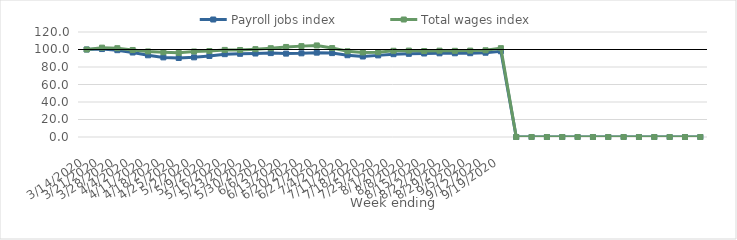
| Category | Payroll jobs index | Total wages index |
|---|---|---|
| 14/03/2020 | 100 | 100 |
| 21/03/2020 | 100.506 | 102.114 |
| 28/03/2020 | 99.227 | 101.498 |
| 04/04/2020 | 96.543 | 99.453 |
| 11/04/2020 | 93.391 | 97.778 |
| 18/04/2020 | 90.995 | 96.86 |
| 25/04/2020 | 90.273 | 96.172 |
| 02/05/2020 | 91.049 | 97.727 |
| 09/05/2020 | 92.612 | 98.286 |
| 16/05/2020 | 94.663 | 99.52 |
| 23/05/2020 | 95.086 | 99.444 |
| 30/05/2020 | 95.404 | 100.386 |
| 06/06/2020 | 95.877 | 101.47 |
| 13/06/2020 | 95.29 | 102.898 |
| 20/06/2020 | 95.639 | 103.856 |
| 27/06/2020 | 96.401 | 104.641 |
| 04/07/2020 | 95.892 | 101.632 |
| 11/07/2020 | 93.447 | 97.978 |
| 18/07/2020 | 91.998 | 96.696 |
| 25/07/2020 | 93.286 | 96.928 |
| 01/08/2020 | 94.656 | 98.542 |
| 08/08/2020 | 95.07 | 98.763 |
| 15/08/2020 | 95.444 | 98.275 |
| 22/08/2020 | 95.654 | 98.676 |
| 29/08/2020 | 95.68 | 98.49 |
| 05/09/2020 | 95.776 | 98.722 |
| 12/09/2020 | 96.314 | 99.123 |
| 19/09/2020 | 97.967 | 101.518 |